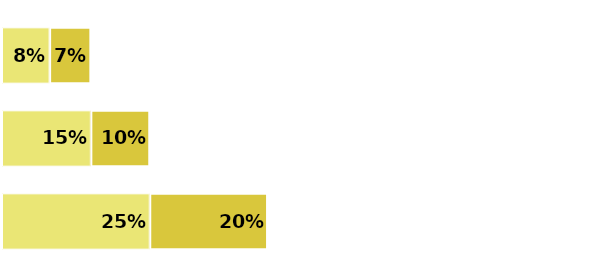
| Category | Disagree | Strongly disagree |
|---|---|---|
| 0 | 0.25 | 0.2 |
| 1 | 0.15 | 0.1 |
| 2 | 0.08 | 0.07 |